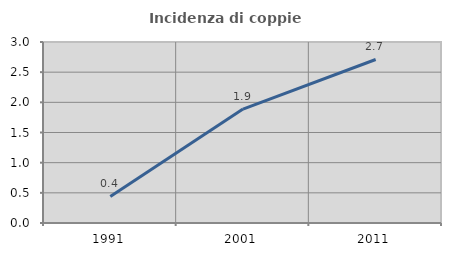
| Category | Incidenza di coppie miste |
|---|---|
| 1991.0 | 0.44 |
| 2001.0 | 1.888 |
| 2011.0 | 2.71 |